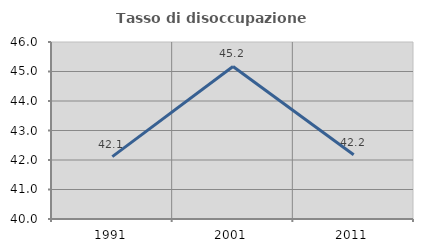
| Category | Tasso di disoccupazione giovanile  |
|---|---|
| 1991.0 | 42.113 |
| 2001.0 | 45.171 |
| 2011.0 | 42.177 |